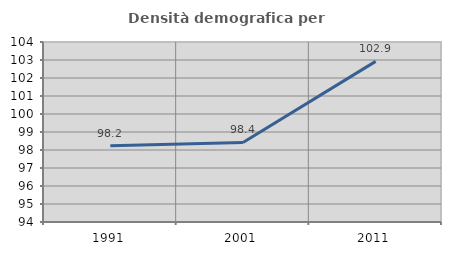
| Category | Densità demografica |
|---|---|
| 1991.0 | 98.237 |
| 2001.0 | 98.417 |
| 2011.0 | 102.924 |